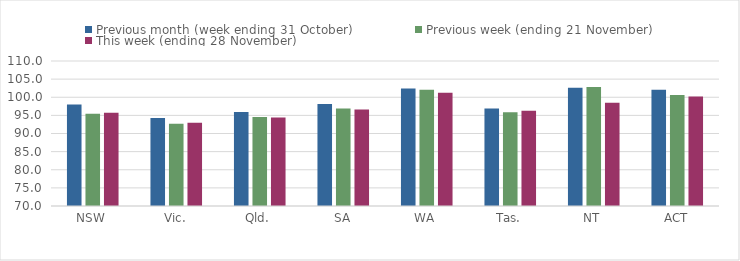
| Category | Previous month (week ending 31 October) | Previous week (ending 21 November) | This week (ending 28 November) |
|---|---|---|---|
| NSW | 97.99 | 95.44 | 95.69 |
| Vic. | 94.26 | 92.68 | 92.95 |
| Qld. | 95.95 | 94.58 | 94.39 |
| SA | 98.16 | 96.88 | 96.63 |
| WA | 102.42 | 102.09 | 101.27 |
| Tas. | 96.88 | 95.87 | 96.3 |
| NT | 102.59 | 102.8 | 98.5 |
| ACT | 102.05 | 100.63 | 100.22 |